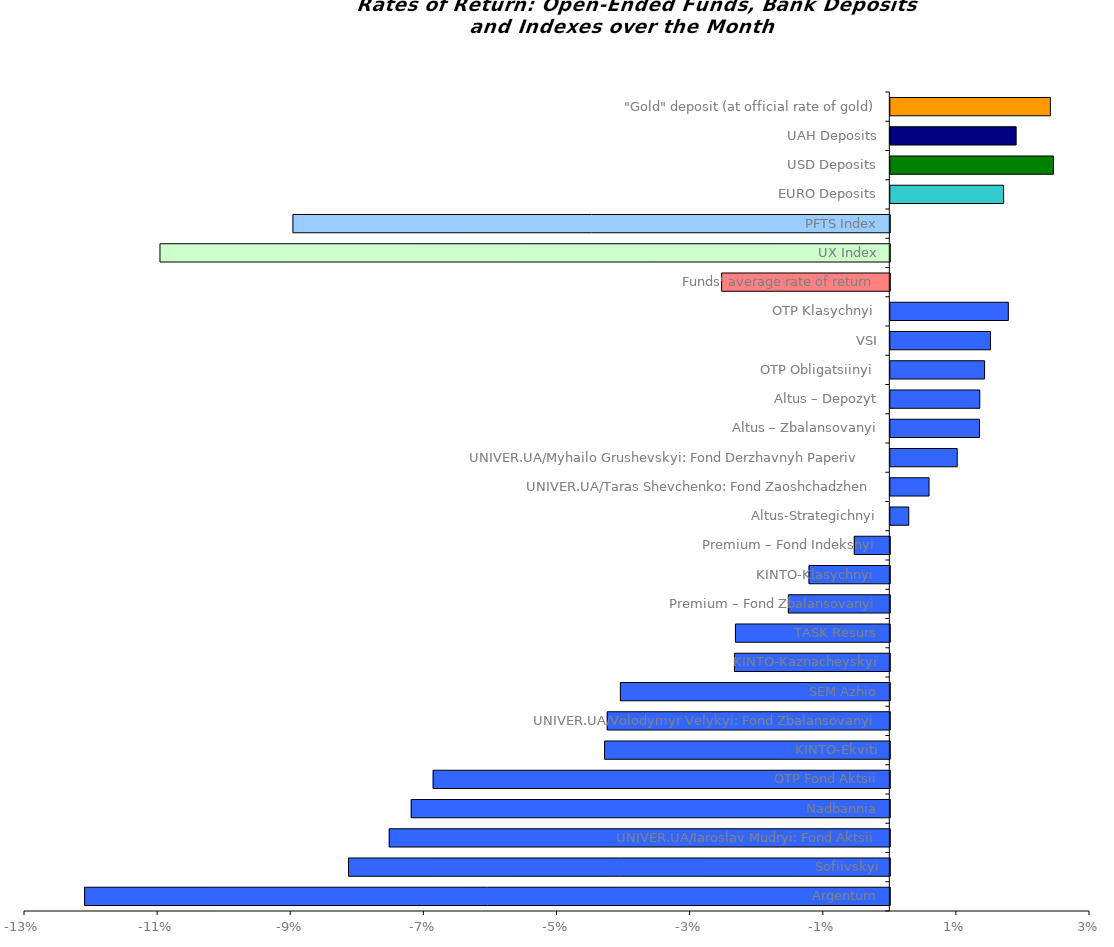
| Category | Series 0 |
|---|---|
| Argentum | -0.121 |
| Sofiivskyi | -0.081 |
| UNIVER.UA/Iaroslav Mudryi: Fond Aktsii | -0.075 |
| Nadbannia | -0.072 |
| OTP Fond Aktsii | -0.069 |
| KINTO-Ekviti | -0.043 |
| UNIVER.UA/Volodymyr Velykyi: Fond Zbalansovanyi | -0.042 |
| SEM Azhio | -0.04 |
| KINTO-Kaznacheyskyi | -0.023 |
| TASK Resurs | -0.023 |
| Premium – Fond Zbalansovanyi | -0.015 |
| KINTO-Klasychnyi  | -0.012 |
| Premium – Fond Indeksnyi | -0.005 |
| Altus-Strategichnyi | 0.003 |
| UNIVER.UA/Taras Shevchenko: Fond Zaoshchadzhen | 0.006 |
| UNIVER.UA/Myhailo Grushevskyi: Fond Derzhavnyh Paperiv    | 0.01 |
| Altus – Zbalansovanyi | 0.013 |
| Altus – Depozyt | 0.013 |
| OTP Obligatsiinyi  | 0.014 |
| VSI | 0.015 |
| OTP Klasychnyi  | 0.018 |
| Funds' average rate of return | -0.025 |
| UX Index | -0.11 |
| PFTS Index | -0.09 |
| EURO Deposits | 0.017 |
| USD Deposits | 0.024 |
| UAH Deposits | 0.019 |
| "Gold" deposit (at official rate of gold) | 0.024 |